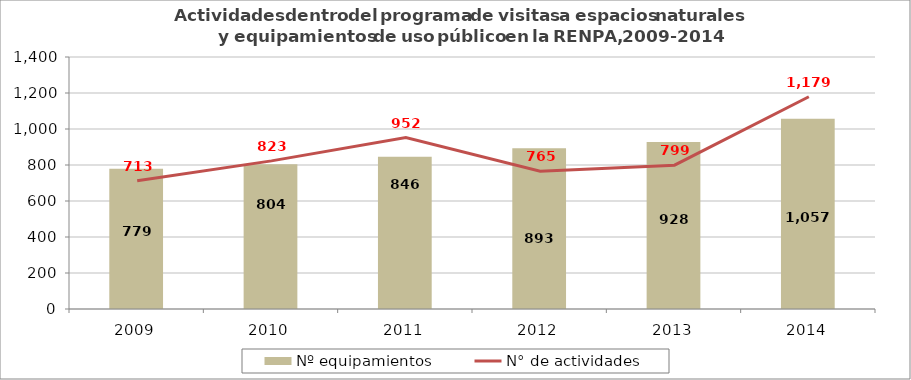
| Category | Nº equipamientos |
|---|---|
| 2009.0 | 779 |
| 2010.0 | 804 |
| 2011.0 | 846 |
| 2012.0 | 893 |
| 2013.0 | 928 |
| 2014.0 | 1057 |